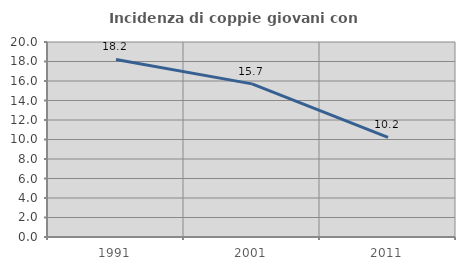
| Category | Incidenza di coppie giovani con figli |
|---|---|
| 1991.0 | 18.213 |
| 2001.0 | 15.704 |
| 2011.0 | 10.215 |